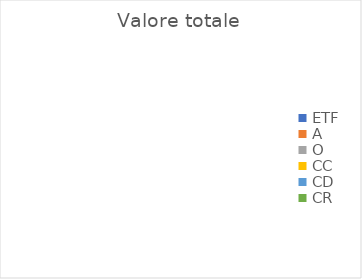
| Category | Valore totale |
|---|---|
| ETF | 0 |
| A | 0 |
| O | 0 |
| CC | 0 |
| CD | 0 |
| CR | 0 |